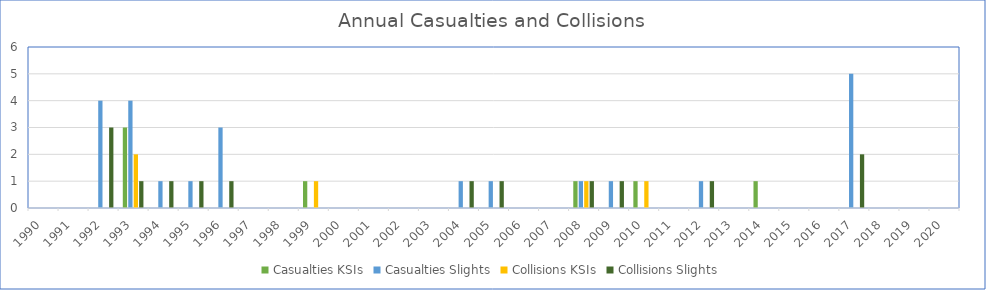
| Category | Casualties | Collisions |
|---|---|---|
| 1990.0 | 0 | 0 |
| 1991.0 | 0 | 0 |
| 1992.0 | 4 | 3 |
| 1993.0 | 4 | 1 |
| 1994.0 | 1 | 1 |
| 1995.0 | 1 | 1 |
| 1996.0 | 3 | 1 |
| 1997.0 | 0 | 0 |
| 1998.0 | 0 | 0 |
| 1999.0 | 0 | 0 |
| 2000.0 | 0 | 0 |
| 2001.0 | 0 | 0 |
| 2002.0 | 0 | 0 |
| 2003.0 | 0 | 0 |
| 2004.0 | 1 | 1 |
| 2005.0 | 1 | 1 |
| 2006.0 | 0 | 0 |
| 2007.0 | 0 | 0 |
| 2008.0 | 1 | 1 |
| 2009.0 | 1 | 1 |
| 2010.0 | 0 | 0 |
| 2011.0 | 0 | 0 |
| 2012.0 | 1 | 1 |
| 2013.0 | 0 | 0 |
| 2014.0 | 0 | 0 |
| 2015.0 | 0 | 0 |
| 2016.0 | 0 | 0 |
| 2017.0 | 5 | 2 |
| 2018.0 | 0 | 0 |
| 2019.0 | 0 | 0 |
| 2020.0 | 0 | 0 |